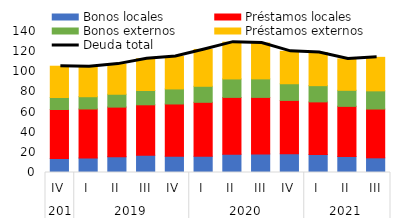
| Category |  Bonos locales  |  Préstamos locales  |  Bonos externos  |  Préstamos externos  |
|---|---|---|---|---|
| 0 | 13.919 | 48.61 | 11.95 | 31.046 |
| 1 | 14.39 | 48.674 | 12.178 | 29.812 |
| 2 | 15.754 | 49.168 | 12.782 | 29.91 |
| 3 | 17.064 | 50.155 | 14.17 | 31.64 |
| 4 | 16.124 | 51.909 | 14.935 | 32.186 |
| 5 | 16.072 | 53.626 | 15.909 | 36.582 |
| 6 | 18.085 | 56.493 | 18.305 | 36.536 |
| 7 | 18.43 | 56.141 | 18.377 | 35.576 |
| 8 | 18.599 | 52.972 | 16.548 | 32.181 |
| 9 | 17.852 | 52.261 | 16.112 | 32.923 |
| 10 | 15.793 | 49.871 | 15.95 | 31.206 |
| 11 | 14.56 | 48.441 | 18.068 | 33.272 |